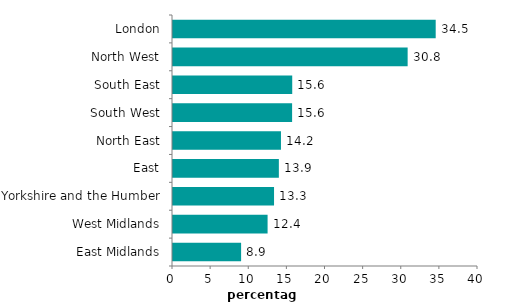
| Category | Series 0 |
|---|---|
| East Midlands | 8.932 |
| West Midlands | 12.405 |
| Yorkshire and the Humber | 13.251 |
| East | 13.883 |
| North East | 14.159 |
| South West | 15.621 |
| South East | 15.636 |
| North West | 30.773 |
| London | 34.452 |